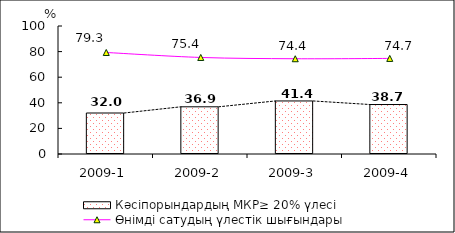
| Category | Кәсіпорындардың МКР≥ 20% үлесі |
|---|---|
| 2009-1 | 32.027 |
| 2009-2 | 36.873 |
| 2009-3 | 41.438 |
| 2009-4 | 38.657 |